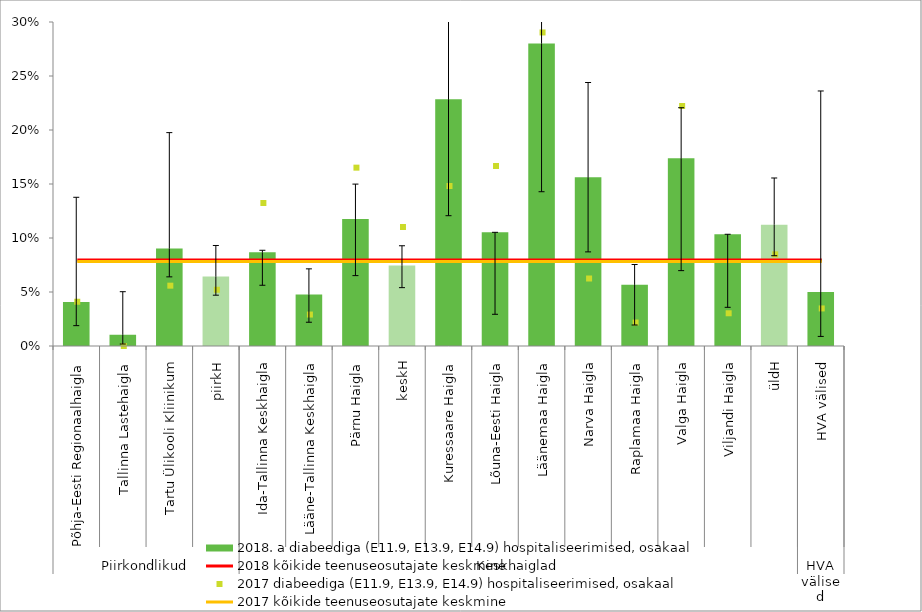
| Category | 2018. a diabeediga (E11.9, E13.9, E14.9) hospitaliseerimised, osakaal |
|---|---|
| 0 | 0.041 |
| 1 | 0.01 |
| 2 | 0.09 |
| 3 | 0.064 |
| 4 | 0.087 |
| 5 | 0.048 |
| 6 | 0.118 |
| 7 | 0.074 |
| 8 | 0.229 |
| 9 | 0.105 |
| 10 | 0.28 |
| 11 | 0.156 |
| 12 | 0.057 |
| 13 | 0.174 |
| 14 | 0.103 |
| 15 | 0.112 |
| 16 | 0.05 |